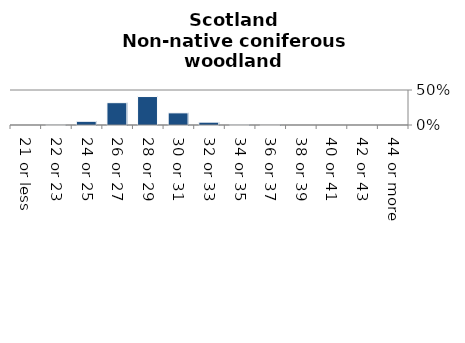
| Category | Non-native coniferous woodland |
|---|---|
| 21 or less | 0 |
| 22 or 23 | 0.002 |
| 24 or 25 | 0.053 |
| 26 or 27 | 0.319 |
| 28 or 29 | 0.407 |
| 30 or 31 | 0.174 |
| 32 or 33 | 0.041 |
| 34 or 35 | 0.004 |
| 36 or 37 | 0.001 |
| 38 or 39 | 0 |
| 40 or 41 | 0 |
| 42 or 43 | 0 |
| 44 or more | 0 |